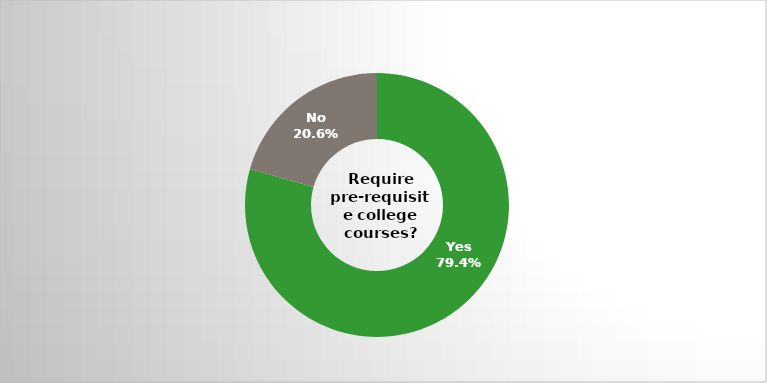
| Category | Series 0 |
|---|---|
| Yes | 0.794 |
| No | 0.206 |